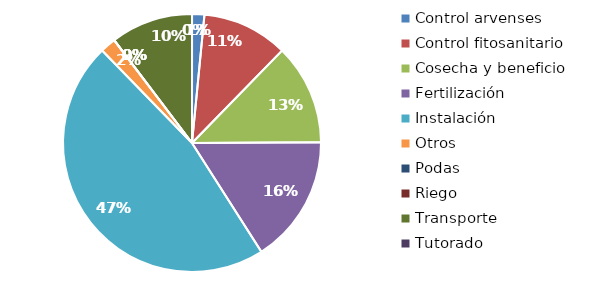
| Category | Valor |
|---|---|
| Control arvenses | 110000 |
| Control fitosanitario | 766200 |
| Cosecha y beneficio | 900000 |
| Fertilización | 1144000 |
| Instalación | 3334000 |
| Otros | 140000 |
| Podas | 0 |
| Riego | 0 |
| Transporte | 735000 |
| Tutorado | 0 |